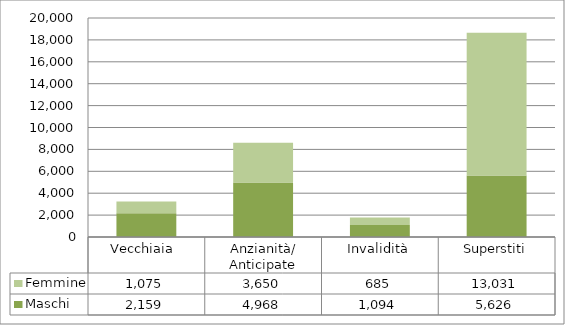
| Category | Maschi | Femmine |
|---|---|---|
| Vecchiaia  | 2159 | 1075 |
| Anzianità/ Anticipate | 4968 | 3650 |
| Invalidità | 1094 | 685 |
| Superstiti | 5626 | 13031 |